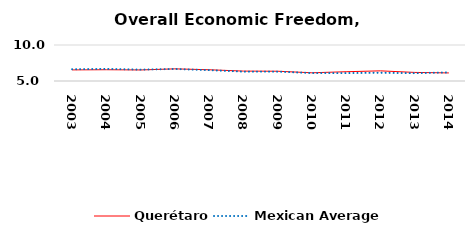
| Category | Querétaro | Mexican Average  |
|---|---|---|
| 2003.0 | 6.542 | 6.632 |
| 2004.0 | 6.566 | 6.678 |
| 2005.0 | 6.533 | 6.582 |
| 2006.0 | 6.688 | 6.668 |
| 2007.0 | 6.561 | 6.508 |
| 2008.0 | 6.374 | 6.3 |
| 2009.0 | 6.358 | 6.3 |
| 2010.0 | 6.141 | 6.105 |
| 2011.0 | 6.288 | 6.103 |
| 2012.0 | 6.41 | 6.144 |
| 2013.0 | 6.193 | 6.087 |
| 2014.0 | 6.121 | 6.195 |